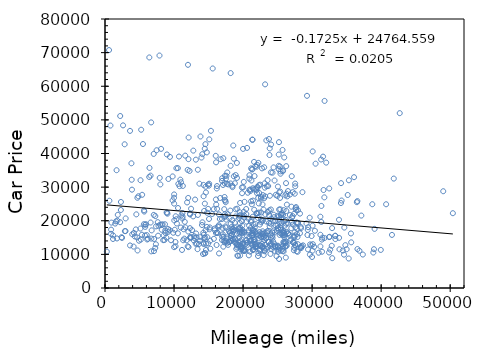
| Category | Series 0 |
|---|---|
| 8221.0 | 17314.103 |
| 9135.0 | 17542.036 |
| 13196.0 | 16218.848 |
| 16342.0 | 16336.913 |
| 19832.0 | 16339.17 |
| 22236.0 | 15709.053 |
| 22576.0 | 15230.003 |
| 22964.0 | 15048.042 |
| 24021.0 | 14862.094 |
| 27325.0 | 15295.018 |
| 10237.0 | 21335.852 |
| 15066.0 | 20538.088 |
| 16633.0 | 20512.094 |
| 19800.0 | 19924.159 |
| 23359.0 | 19774.249 |
| 23765.0 | 19344.166 |
| 24008.0 | 19105.13 |
| 26034.0 | 18543.427 |
| 32896.0 | 17808.199 |
| 34665.0 | 17968.838 |
| 8970.0 | 22358.878 |
| 10577.0 | 23785.923 |
| 14363.0 | 22926.09 |
| 16508.0 | 21895.759 |
| 18908.0 | 21273.062 |
| 19467.0 | 21460.014 |
| 21394.0 | 21183.124 |
| 22596.0 | 20406.1 |
| 24469.0 | 21058.14 |
| 25245.0 | 19556.899 |
| 15755.0 | 23447.687 |
| 16235.0 | 23547.239 |
| 18147.0 | 23016.008 |
| 22102.0 | 22230.028 |
| 23612.0 | 22625.074 |
| 24439.0 | 21799.172 |
| 25212.0 | 21341.257 |
| 26779.0 | 21683.031 |
| 27096.0 | 20986.016 |
| 29649.0 | 20902.104 |
| 2992.0 | 20698.077 |
| 10036.0 | 20099.257 |
| 18339.0 | 18145.126 |
| 19592.0 | 17944.857 |
| 21797.0 | 19027.862 |
| 23852.0 | 18348.899 |
| 25040.0 | 17750.885 |
| 25052.0 | 17772.97 |
| 25464.0 | 17394.021 |
| 27830.0 | 17645.745 |
| 17353.0 | 21908.367 |
| 17787.0 | 21956.343 |
| 19562.0 | 21646.117 |
| 20137.0 | 21575.457 |
| 20158.0 | 20952.218 |
| 23767.0 | 21562.048 |
| 24323.0 | 19981.128 |
| 27839.0 | 19425.849 |
| 29187.0 | 19191.99 |
| 31324.0 | 19641.742 |
| 2308.0 | 25589.983 |
| 10014.0 | 25098.629 |
| 18910.0 | 23420.707 |
| 20105.0 | 22661.048 |
| 20453.0 | 23493.082 |
| 22287.0 | 22435.203 |
| 23237.0 | 21878.12 |
| 23798.0 | 23077.566 |
| 25489.0 | 21698.015 |
| 25564.0 | 21831.823 |
| 4695.0 | 26831.194 |
| 9795.0 | 26060.335 |
| 12052.0 | 26781.815 |
| 13050.0 | 26302.074 |
| 17335.0 | 26190.271 |
| 17480.0 | 25508.211 |
| 24027.0 | 23348.017 |
| 25387.0 | 23406.69 |
| 25869.0 | 23159.544 |
| 37128.0 | 21536.742 |
| 2202.0 | 51154.047 |
| 6685.0 | 49248.159 |
| 15343.0 | 46747.673 |
| 21341.0 | 44130.617 |
| 21367.0 | 44084.914 |
| 23371.0 | 43892.468 |
| 23751.0 | 44300.64 |
| 24052.0 | 42677.601 |
| 25199.0 | 43374.052 |
| 30082.0 | 40619.072 |
| 6598.0 | 33417.965 |
| 10625.0 | 30957.081 |
| 11013.0 | 31431.13 |
| 14937.0 | 30781.516 |
| 17094.0 | 30646.438 |
| 17870.0 | 30792.149 |
| 18449.0 | 30392.75 |
| 21039.0 | 28817.082 |
| 21056.0 | 29275.209 |
| 27484.0 | 28040.129 |
| 14095.0 | 39801.551 |
| 14743.0 | 40335.737 |
| 16041.0 | 39307.009 |
| 17138.0 | 38600.24 |
| 18661.0 | 38445.897 |
| 21966.0 | 36077.796 |
| 24415.0 | 35866.583 |
| 25163.0 | 35338.654 |
| 25339.0 | 36154.304 |
| 25421.0 | 34685.663 |
| 5499.0 | 42820.329 |
| 8125.0 | 41378.048 |
| 12791.0 | 40856.391 |
| 14452.0 | 41419.037 |
| 21593.0 | 37510.254 |
| 22211.0 | 37215.169 |
| 25153.0 | 36332.895 |
| 26250.0 | 36245.158 |
| 36074.0 | 32954.141 |
| 41829.0 | 32537.187 |
| 6447.0 | 35715.769 |
| 10555.0 | 35651.68 |
| 11975.0 | 35129.341 |
| 13449.0 | 35165.759 |
| 17508.0 | 32501.245 |
| 18661.0 | 33220.028 |
| 20910.0 | 32509.478 |
| 23124.0 | 31132.213 |
| 26222.0 | 31181.715 |
| 27544.0 | 31059.181 |
| 2846.0 | 42741.524 |
| 7476.0 | 40966.607 |
| 13973.0 | 38795.379 |
| 16754.0 | 38297.463 |
| 19100.0 | 37192.896 |
| 21778.0 | 36210.123 |
| 22042.0 | 36633.634 |
| 23056.0 | 35895.499 |
| 25796.0 | 34974.378 |
| 35326.0 | 32038.34 |
| 788.0 | 48310.33 |
| 2616.0 | 48365.981 |
| 13829.0 | 45061.952 |
| 15104.0 | 44205.876 |
| 18581.0 | 42377.955 |
| 20575.0 | 41671.583 |
| 23861.0 | 41516.43 |
| 25717.0 | 41053.482 |
| 31303.0 | 38208.501 |
| 31587.0 | 39072.392 |
| 583.0 | 70755.467 |
| 6420.0 | 68566.187 |
| 7892.0 | 69133.732 |
| 12021.0 | 66374.307 |
| 15600.0 | 65281.481 |
| 18200.0 | 63913.117 |
| 23193.0 | 60567.549 |
| 29260.0 | 57154.443 |
| 31805.0 | 55639.088 |
| 42691.0 | 52001.994 |
| 10011.0 | 12146.188 |
| 12101.0 | 12163.82 |
| 19699.0 | 11472.023 |
| 20100.0 | 11017.169 |
| 20334.0 | 11096.857 |
| 22225.0 | 10386.04 |
| 22484.0 | 11137.046 |
| 24568.0 | 11045.109 |
| 27906.0 | 10777.053 |
| 29680.0 | 9928.188 |
| 3629.0 | 12649.111 |
| 4142.0 | 12314.591 |
| 11156.0 | 11318.008 |
| 11981.0 | 12409.949 |
| 13404.0 | 11555.267 |
| 15253.0 | 11700.111 |
| 19945.0 | 11215.019 |
| 23963.0 | 10144.952 |
| 30948.0 | 10491.075 |
| 37345.0 | 9954.054 |
| 20156.0 | 11031.13 |
| 20186.0 | 11343.054 |
| 21421.0 | 11391.214 |
| 21427.0 | 11247.863 |
| 23119.0 | 10921.945 |
| 23121.0 | 11179.954 |
| 25107.0 | 11394.886 |
| 25476.0 | 11070.061 |
| 25746.0 | 11013.871 |
| 30056.0 | 11115.014 |
| 7278.0 | 11918.456 |
| 10213.0 | 12408.806 |
| 14627.0 | 11302.903 |
| 19014.0 | 11615.021 |
| 21013.0 | 10805.13 |
| 22380.0 | 11169.918 |
| 25065.0 | 10770.107 |
| 25869.0 | 10872.014 |
| 27776.0 | 10921.945 |
| 34621.0 | 9919.048 |
| 266.0 | 10813.344 |
| 4716.0 | 11167.861 |
| 6699.0 | 10897.077 |
| 14200.0 | 10106.016 |
| 14521.0 | 10354.044 |
| 16521.0 | 10287.977 |
| 20836.0 | 9720.979 |
| 22169.0 | 9506.048 |
| 22986.0 | 9789.038 |
| 29992.0 | 9220.83 |
| 7091.0 | 10971.096 |
| 14438.0 | 10315.018 |
| 19183.0 | 9654.06 |
| 19273.0 | 9563.789 |
| 19565.0 | 9665.849 |
| 24842.0 | 9482.219 |
| 25216.0 | 8638.931 |
| 26191.0 | 9041.906 |
| 32914.0 | 8870.947 |
| 35299.0 | 8768.999 |
| 7372.0 | 13007.984 |
| 13607.0 | 13041.874 |
| 19136.0 | 12045.921 |
| 19712.0 | 12469.528 |
| 22405.0 | 11539.846 |
| 23103.0 | 11726.003 |
| 23512.0 | 12207.873 |
| 27364.0 | 11203.146 |
| 31436.0 | 10788.97 |
| 34447.0 | 11149.618 |
| 1160.0 | 14584.448 |
| 10210.0 | 13681.698 |
| 17741.0 | 13446.213 |
| 19347.0 | 12327.642 |
| 19612.0 | 12274.958 |
| 22571.0 | 12630.775 |
| 22771.0 | 12425.389 |
| 24568.0 | 12319.696 |
| 25816.0 | 12549.892 |
| 30297.0 | 12234.888 |
| 2464.0 | 14894.983 |
| 11322.0 | 14198.092 |
| 11488.0 | 14678.105 |
| 14630.0 | 13167.702 |
| 18910.0 | 13471.005 |
| 25048.0 | 12573.9 |
| 25069.0 | 12383.403 |
| 25862.0 | 13230.919 |
| 36855.0 | 11080.516 |
| 39946.0 | 11328.959 |
| 4652.0 | 15053.934 |
| 5189.0 | 14397.928 |
| 6224.0 | 14642.324 |
| 14231.0 | 13464.803 |
| 17971.0 | 13678.863 |
| 19715.0 | 12507.485 |
| 19898.0 | 13141.048 |
| 20682.0 | 13594.086 |
| 21386.0 | 12733.858 |
| 28408.0 | 12230.1 |
| 8427.0 | 14222.305 |
| 8615.0 | 14266.913 |
| 16958.0 | 14255.748 |
| 18040.0 | 13762.901 |
| 18533.0 | 14275.128 |
| 18766.0 | 13688 |
| 20043.0 | 13308.834 |
| 20512.0 | 14145.881 |
| 21684.0 | 12944.939 |
| 27560.0 | 12846.062 |
| 4922.0 | 14061.123 |
| 14311.0 | 13072.842 |
| 19816.0 | 11699.034 |
| 21492.0 | 12257.164 |
| 21525.0 | 11574.174 |
| 24163.0 | 11539.049 |
| 25014.0 | 12243.061 |
| 25727.0 | 11671.858 |
| 29410.0 | 11464.629 |
| 38866.0 | 10546.783 |
| 7695.0 | 15553.209 |
| 12305.0 | 15047.003 |
| 17343.0 | 13540.042 |
| 17445.0 | 14077.969 |
| 20309.0 | 12981.952 |
| 20530.0 | 13436 |
| 21145.0 | 13161.943 |
| 23069.0 | 14220.013 |
| 31199.0 | 12379.126 |
| 36566.0 | 11581.905 |
| 13776.0 | 14023.939 |
| 19461.0 | 12810.911 |
| 21796.0 | 13135.905 |
| 21910.0 | 13106.9 |
| 22382.0 | 12845.174 |
| 22479.0 | 12570.137 |
| 23200.0 | 12897.93 |
| 27394.0 | 11961.62 |
| 27521.0 | 12706.911 |
| 28492.0 | 12487.054 |
| 1169.0 | 15635.796 |
| 6048.0 | 15747.804 |
| 15768.0 | 14619.079 |
| 20374.0 | 14185.022 |
| 25845.0 | 13699.036 |
| 26143.0 | 13310.06 |
| 27249.0 | 13530.069 |
| 27942.0 | 13019.071 |
| 29891.0 | 12684.986 |
| 32844.0 | 12553.071 |
| 8880.0 | 14997.884 |
| 12980.0 | 14847.044 |
| 13828.0 | 15128.992 |
| 14504.0 | 15000.993 |
| 18790.0 | 14593.854 |
| 21128.0 | 14304.741 |
| 21611.0 | 13688.946 |
| 23748.0 | 13744.85 |
| 27431.0 | 13545.031 |
| 34815.0 | 12741.19 |
| 865.0 | 16116.844 |
| 9882.0 | 16428.579 |
| 14824.0 | 15084.815 |
| 17158.0 | 15163.17 |
| 18210.0 | 14897.041 |
| 18910.0 | 14508.75 |
| 19818.0 | 14418.165 |
| 21181.0 | 14191.882 |
| 21527.0 | 14401.907 |
| 21627.0 | 14175.879 |
| 6114.0 | 14429.79 |
| 6709.0 | 14696.029 |
| 7115.0 | 14582.769 |
| 9561.0 | 14194.824 |
| 15233.0 | 14072.135 |
| 17270.0 | 13994.906 |
| 17594.0 | 13830.249 |
| 22740.0 | 13159.822 |
| 26204.0 | 12495.971 |
| 28683.0 | 12678.854 |
| 3625.0 | 46732.606 |
| 5239.0 | 47065.21 |
| 12115.0 | 44749.687 |
| 14546.0 | 42773.028 |
| 20000.0 | 41371.379 |
| 23826.0 | 39547.588 |
| 25169.0 | 39691.727 |
| 25960.0 | 38824.869 |
| 30502.0 | 36970.898 |
| 32039.0 | 37288.937 |
| 7054.0 | 39875.854 |
| 8967.0 | 39713.668 |
| 9410.0 | 38990.607 |
| 10717.0 | 39092.19 |
| 11619.0 | 39365.883 |
| 21350.0 | 35261.436 |
| 22740.0 | 35575.417 |
| 24259.0 | 34297.305 |
| 25747.0 | 34739.215 |
| 34191.0 | 31186.741 |
| 1853.0 | 21757.05 |
| 14115.0 | 19528.1 |
| 18198.0 | 19075.679 |
| 18795.0 | 19409.753 |
| 19874.0 | 18527.209 |
| 21512.0 | 18912.982 |
| 25453.0 | 17839.801 |
| 26980.0 | 17789.347 |
| 29368.0 | 17294.181 |
| 29420.0 | 18083.396 |
| 1787.0 | 20021.195 |
| 8211.0 | 18835.19 |
| 14054.0 | 18727.508 |
| 19498.0 | 16805.057 |
| 21567.0 | 17154.576 |
| 22383.0 | 16644.088 |
| 26070.0 | 15951.811 |
| 27460.0 | 16508.591 |
| 31202.0 | 15832.518 |
| 33357.0 | 15554.283 |
| 636.0 | 25948.963 |
| 5379.0 | 27714.05 |
| 14461.0 | 25097.473 |
| 16111.0 | 24809.042 |
| 22964.0 | 23345.329 |
| 26272.0 | 22894.439 |
| 27384.0 | 22064.292 |
| 27940.0 | 23151.546 |
| 28242.0 | 22120.758 |
| 33892.0 | 20294.577 |
| 5936.0 | 18957.89 |
| 8687.0 | 18950.907 |
| 17020.0 | 17891.634 |
| 19386.0 | 17801.23 |
| 19740.0 | 16723.994 |
| 21829.0 | 16744.03 |
| 23460.0 | 16825.191 |
| 24583.0 | 16543.98 |
| 26532.0 | 16143.957 |
| 33906.0 | 14914.201 |
| 1480.0 | 19164.611 |
| 7961.0 | 18800.959 |
| 15144.0 | 17458.222 |
| 21417.0 | 17158.922 |
| 21675.0 | 16472.898 |
| 23621.0 | 16993.78 |
| 25697.0 | 16300.465 |
| 27476.0 | 15623.2 |
| 32462.0 | 15138.401 |
| 32535.0 | 15233.16 |
| 6608.0 | 19471.975 |
| 15190.0 | 18009.846 |
| 16335.0 | 18273.006 |
| 17441.0 | 18311.756 |
| 18451.0 | 17553.754 |
| 18771.0 | 18004.87 |
| 19490.0 | 17663.225 |
| 24461.0 | 17115.122 |
| 24905.0 | 16988.303 |
| 25874.0 | 16803.123 |
| 932.0 | 19446.883 |
| 18277.0 | 17119.458 |
| 19593.0 | 17316.097 |
| 19883.0 | 16860.871 |
| 21420.0 | 17312.907 |
| 23133.0 | 16403.254 |
| 24218.0 | 16536.744 |
| 25394.0 | 16341.804 |
| 26328.0 | 16713.985 |
| 28239.0 | 16295.211 |
| 5632.0 | 18974.922 |
| 7397.0 | 18324.832 |
| 7645.0 | 19581.231 |
| 14754.0 | 18169.375 |
| 17488.0 | 17986.224 |
| 18721.0 | 17173.942 |
| 20200.0 | 16456.975 |
| 21452.0 | 16267.095 |
| 22841.0 | 16860.094 |
| 22889.0 | 16027.286 |
| 8732.0 | 17089.919 |
| 11393.0 | 17463.046 |
| 14579.0 | 17218.686 |
| 15903.0 | 17162.478 |
| 17451.0 | 16507.07 |
| 18562.0 | 16752.514 |
| 20154.0 | 16646.771 |
| 21272.0 | 15623.92 |
| 25787.0 | 15664.625 |
| 25956.0 | 15680.864 |
| 5827.0 | 18800.093 |
| 8345.0 | 18910.804 |
| 10414.0 | 19177.412 |
| 11647.0 | 18040.144 |
| 15898.0 | 17685.201 |
| 18602.0 | 17515.398 |
| 23491.0 | 16357.992 |
| 25931.0 | 16345.944 |
| 26700.0 | 15797.196 |
| 33345.0 | 15503.509 |
| 7065.0 | 21745.029 |
| 13457.0 | 21725.011 |
| 14788.0 | 22384.119 |
| 16950.0 | 20537.142 |
| 17337.0 | 21233.911 |
| 18021.0 | 20676.166 |
| 22152.0 | 20839.15 |
| 22729.0 | 20017.968 |
| 27218.0 | 18876.871 |
| 39049.0 | 17586.929 |
| 12466.0 | 23573.822 |
| 14948.0 | 23527.729 |
| 21992.0 | 22113.628 |
| 22626.0 | 22470.358 |
| 24067.0 | 20619.114 |
| 24665.0 | 20047.951 |
| 25020.0 | 21525.339 |
| 25240.0 | 20382.15 |
| 25550.0 | 21020.837 |
| 26223.0 | 20221.809 |
| 11892.0 | 25452.474 |
| 17273.0 | 23449.306 |
| 19148.0 | 23578.165 |
| 19521.0 | 22525.27 |
| 20472.0 | 21982.648 |
| 21929.0 | 22231.563 |
| 25651.0 | 22189.116 |
| 25794.0 | 21765.067 |
| 27168.0 | 21403.756 |
| 31197.0 | 21200.69 |
| 11554.0 | 19682.035 |
| 16496.0 | 18678.414 |
| 17583.0 | 20318.891 |
| 18419.0 | 20127.044 |
| 20510.0 | 19751.041 |
| 21121.0 | 17844.731 |
| 22423.0 | 18856.019 |
| 24747.0 | 18566.071 |
| 27574.0 | 18063.005 |
| 28385.0 | 17768.06 |
| 2295.0 | 23197.437 |
| 5653.0 | 23102.022 |
| 8928.0 | 22460.53 |
| 11069.0 | 21607.773 |
| 15516.0 | 22004.93 |
| 19419.0 | 20830.994 |
| 22891.0 | 20109.904 |
| 26252.0 | 19116.131 |
| 27077.0 | 19689.741 |
| 27966.0 | 19338.376 |
| 4537.0 | 21903.323 |
| 5690.0 | 22736.834 |
| 9049.0 | 22104.974 |
| 11221.0 | 22311.05 |
| 12313.0 | 21875.098 |
| 20770.0 | 20627.662 |
| 22628.0 | 19540.245 |
| 26477.0 | 19204.809 |
| 28354.0 | 18158.083 |
| 30063.0 | 18529.342 |
| 7287.0 | 21383.067 |
| 10338.0 | 20452.669 |
| 11204.0 | 20677.594 |
| 19539.0 | 19294.788 |
| 20870.0 | 18548.979 |
| 21702.0 | 18042.221 |
| 25516.0 | 18620.871 |
| 30404.0 | 17023.937 |
| 35624.0 | 16216.981 |
| 41566.0 | 15792.831 |
| 881.0 | 17360.811 |
| 5131.0 | 17675.837 |
| 6761.0 | 17141.941 |
| 9380.0 | 17202.834 |
| 12071.0 | 16792.68 |
| 18315.0 | 15595.884 |
| 20917.0 | 15253.869 |
| 22414.0 | 15594.807 |
| 22641.0 | 15059.134 |
| 23335.0 | 14703.137 |
| 3946.0 | 15979.015 |
| 4188.0 | 16379.853 |
| 4318.0 | 15327.1 |
| 5350.0 | 15846.013 |
| 5788.0 | 15604.146 |
| 12420.0 | 14841.917 |
| 13262.0 | 15077.176 |
| 19602.0 | 13961.112 |
| 23976.0 | 13034.069 |
| 24542.0 | 13162.852 |
| 16554.0 | 18254.923 |
| 18720.0 | 17095.035 |
| 20829.0 | 17162.873 |
| 21304.0 | 16391.172 |
| 25295.0 | 15788.105 |
| 25777.0 | 16569.141 |
| 25830.0 | 16997.694 |
| 26511.0 | 16283.959 |
| 29925.0 | 15457.171 |
| 31471.0 | 14963.046 |
| 11229.0 | 21230.978 |
| 12314.0 | 22100.393 |
| 12772.0 | 21300.019 |
| 17417.0 | 21281.88 |
| 21132.0 | 19646.717 |
| 21211.0 | 20173.906 |
| 24992.0 | 18701.223 |
| 25557.0 | 19423.165 |
| 26028.0 | 19956.758 |
| 27721.0 | 19448.226 |
| 1592.0 | 19822.115 |
| 2189.0 | 19567.259 |
| 17959.0 | 16853.108 |
| 20751.0 | 16516.956 |
| 21974.0 | 15979.015 |
| 22637.0 | 16256.236 |
| 23989.0 | 15724.252 |
| 25598.0 | 15967.245 |
| 27800.0 | 16041.686 |
| 29325.0 | 15756.146 |
| 9185.0 | 32422.761 |
| 10915.0 | 32219.589 |
| 13678.0 | 31024.872 |
| 16193.0 | 29595.794 |
| 21418.0 | 29664.703 |
| 23886.0 | 27425.844 |
| 24960.0 | 27370.958 |
| 26126.0 | 27548.63 |
| 27199.0 | 28502.306 |
| 36480.0 | 25527.013 |
| 13145.0 | 13160.125 |
| 17830.0 | 12830.099 |
| 19081.0 | 12828.031 |
| 19225.0 | 12878.047 |
| 20618.0 | 12832.462 |
| 21891.0 | 12464.073 |
| 23931.0 | 12465.509 |
| 24318.0 | 12258.858 |
| 25285.0 | 11903.098 |
| 26097.0 | 12209.56 |
| 18096.0 | 16391.927 |
| 18391.0 | 16033.931 |
| 19465.0 | 16106.827 |
| 19531.0 | 16551.22 |
| 19894.0 | 17325.27 |
| 22779.0 | 16078.665 |
| 23062.0 | 15297.836 |
| 24239.0 | 15505.294 |
| 27887.0 | 15174.347 |
| 33374.0 | 14546.885 |
| 12303.0 | 17803.279 |
| 16078.0 | 16353.097 |
| 17053.0 | 15977.911 |
| 18206.0 | 15568.974 |
| 21307.0 | 15589.78 |
| 21391.0 | 15730.046 |
| 21461.0 | 15802.653 |
| 27438.0 | 15086.9 |
| 31424.0 | 14396.271 |
| 31791.0 | 14869.282 |
| 2973.0 | 16927.78 |
| 4463.0 | 17418.069 |
| 8754.0 | 16379.099 |
| 9150.0 | 16706.674 |
| 12610.0 | 17214.325 |
| 14304.0 | 15821.95 |
| 21688.0 | 14398.923 |
| 23217.0 | 15622.121 |
| 23323.0 | 14909.051 |
| 24270.0 | 14853.199 |
| 10340.0 | 35622.139 |
| 12251.0 | 34819.297 |
| 17711.0 | 34355.004 |
| 19112.0 | 32737.085 |
| 20925.0 | 33540.536 |
| 21208.0 | 31970.542 |
| 21661.0 | 33287.41 |
| 23553.0 | 32075.985 |
| 24559.0 | 31969.07 |
| 35157.0 | 27666.231 |
| 3907.0 | 29246.237 |
| 16068.0 | 26337.831 |
| 16688.0 | 26775.032 |
| 19569.0 | 25299.97 |
| 21266.0 | 24896.598 |
| 21433.0 | 25996.806 |
| 26345.0 | 24801.617 |
| 27674.0 | 24063.013 |
| 27686.0 | 23249.842 |
| 50387.0 | 22244.877 |
| 3828.0 | 37088.562 |
| 17381.0 | 33381.819 |
| 17590.0 | 33358.768 |
| 18930.0 | 33586.906 |
| 22479.0 | 30731.942 |
| 23635.0 | 30315.169 |
| 25049.0 | 30166.853 |
| 27558.0 | 30251.018 |
| 31655.0 | 29142.714 |
| 32477.0 | 29612.154 |
| 10003.0 | 26841.081 |
| 10014.0 | 27825.95 |
| 14281.0 | 27284.751 |
| 17319.0 | 27060.138 |
| 20208.0 | 25618.282 |
| 21160.0 | 25790.514 |
| 22272.0 | 25148.379 |
| 22814.0 | 24852.495 |
| 27015.0 | 24173.526 |
| 27600.0 | 23733.402 |
| 12090.0 | 38324.809 |
| 13162.0 | 38167.174 |
| 16088.0 | 37383.503 |
| 18195.0 | 36338.751 |
| 21167.0 | 35580.332 |
| 21293.0 | 35304.495 |
| 24031.0 | 34392.995 |
| 25420.0 | 33984.431 |
| 27051.0 | 33248.343 |
| 48991.0 | 28777.96 |
| 3867.0 | 32197.34 |
| 5144.0 | 32053.097 |
| 10800.0 | 30274.711 |
| 11273.0 | 30353.586 |
| 14568.0 | 30122.43 |
| 22189.0 | 26789.833 |
| 22328.0 | 28291.762 |
| 22598.0 | 27109.406 |
| 26400.0 | 27256.495 |
| 34175.0 | 25267.368 |
| 1676.0 | 35033.215 |
| 7924.0 | 32746.131 |
| 9795.0 | 33183.333 |
| 15087.0 | 31002.734 |
| 22052.0 | 30075.995 |
| 23143.0 | 29844.204 |
| 25247.0 | 28432.824 |
| 26276.0 | 28054.982 |
| 28598.0 | 28502.962 |
| 38717.0 | 24912.081 |
| 16956.0 | 31849.308 |
| 16975.0 | 32649.761 |
| 20015.0 | 29961.255 |
| 20103.0 | 31554.405 |
| 22105.0 | 29914.38 |
| 22298.0 | 30575.249 |
| 23426.0 | 30271.922 |
| 25380.0 | 28678.075 |
| 26503.0 | 28829.028 |
| 31773.0 | 26955.041 |
| 6409.0 | 33005.78 |
| 14278.0 | 30661.26 |
| 15050.0 | 30443.88 |
| 16225.0 | 30322.151 |
| 17317.0 | 31153.009 |
| 18187.0 | 31084.938 |
| 18805.0 | 31156.596 |
| 21960.0 | 29114.545 |
| 36557.0 | 25845.206 |
| 40719.0 | 24903.478 |
| 8017.0 | 30800.658 |
| 14613.0 | 28416.462 |
| 19854.0 | 28185.776 |
| 22021.0 | 28204.604 |
| 22590.0 | 26653.239 |
| 22881.0 | 27610.864 |
| 23055.0 | 26698.078 |
| 23204.0 | 27241.436 |
| 24738.0 | 27703.204 |
| 31344.0 | 24405.067 |
| 17673.0 | 30959.932 |
| 18464.0 | 29986.792 |
| 19830.0 | 29908.181 |
| 20685.0 | 28328.267 |
| 20907.0 | 29197.791 |
| 21545.0 | 29321.083 |
| 21822.0 | 29481.529 |
| 25357.0 | 26792.3 |
| 26786.0 | 27788.813 |
| 34269.0 | 26012.375 |
| 4836.0 | 27280.982 |
| 17431.0 | 25959.122 |
| 21616.0 | 23274.481 |
| 25218.0 | 23329.208 |
| 2879.0 | 16916.87 |
| 8507.0 | 15639.037 |
| 10555.0 | 16256.236 |
| 12920.0 | 15395.011 |
| 14376.0 | 14881.955 |
| 16951.0 | 15277.068 |
| 17656.0 | 14702.798 |
| 19455.0 | 15033.15 |
| 21020.0 | 13991.04 |
| 22255.0 | 14771.003 |
| 23645.0 | 13719.238 |
| 24349.0 | 13869.155 |
| 25981.0 | 13518.235 |
| 26034.0 | 13825.155 |
| 26236.0 | 13811.155 |
| 26788.0 | 14077.969 |
| 26986.0 | 14411.859 |
| 27231.0 | 13600.034 |
| 30108.0 | 13032.868 |
| 38958.0 | 11539.049 |
| 1737.0 | 14739.067 |
| 2392.0 | 15110.193 |
| 11836.0 | 14202.997 |
| 12412.0 | 15194.975 |
| 12878.0 | 14116.922 |
| 13318.0 | 13174.071 |
| 14938.0 | 13258.366 |
| 16163.0 | 12791.751 |
| 17139.0 | 12293.06 |
| 18257.0 | 13998.129 |
| 18511.0 | 14568.002 |
| 19101.0 | 13122.905 |
| 19500.0 | 13494.289 |
| 19853.0 | 12036.217 |
| 21770.0 | 12162.14 |
| 21877.0 | 12333.604 |
| 22758.0 | 12099.015 |
| 22826.0 | 12119.09 |
| 23388.0 | 11679.924 |
| 24069.0 | 13216.912 |
| 24664.0 | 12412.521 |
| 24740.0 | 12284.288 |
| 26328.0 | 12594.183 |
| 28298.0 | 12105.981 |
| 28398.0 | 11873.534 |
| 29707.0 | 12965.223 |
| 32458.0 | 10563.066 |
| 32619.0 | 11413.53 |
| 33962.0 | 11504.825 |
| 34998.0 | 11521.526 |
| 5826.0 | 18173.978 |
| 7755.0 | 18490.983 |
| 10102.0 | 17322.078 |
| 10986.0 | 17978.357 |
| 14242.0 | 16425.175 |
| 16229.0 | 16507.07 |
| 19095.0 | 16175.958 |
| 20484.0 | 15731.133 |
| 25979.0 | 15118.893 |
| 35662.0 | 13585.637 |